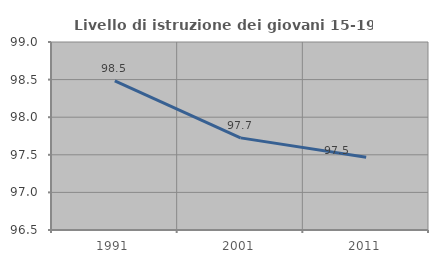
| Category | Livello di istruzione dei giovani 15-19 anni |
|---|---|
| 1991.0 | 98.482 |
| 2001.0 | 97.725 |
| 2011.0 | 97.468 |